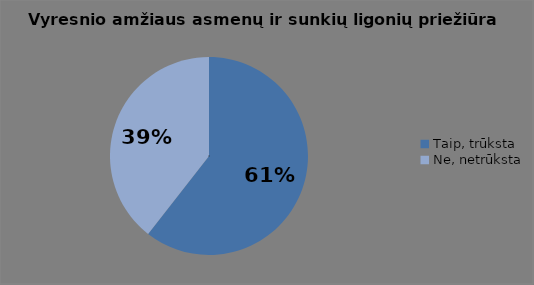
| Category | Series 0 |
|---|---|
| Taip, trūksta | 66 |
| Ne, netrūksta | 43 |